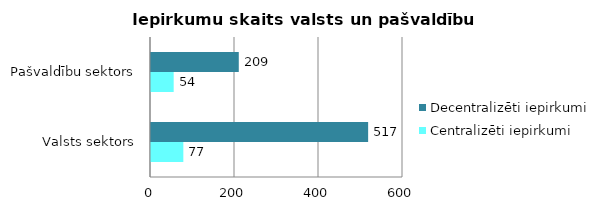
| Category | Centralizēti iepirkumi | Decentralizēti iepirkumi |
|---|---|---|
| Valsts sektors | 77 | 517 |
| Pašvaldību sektors | 54 | 209 |